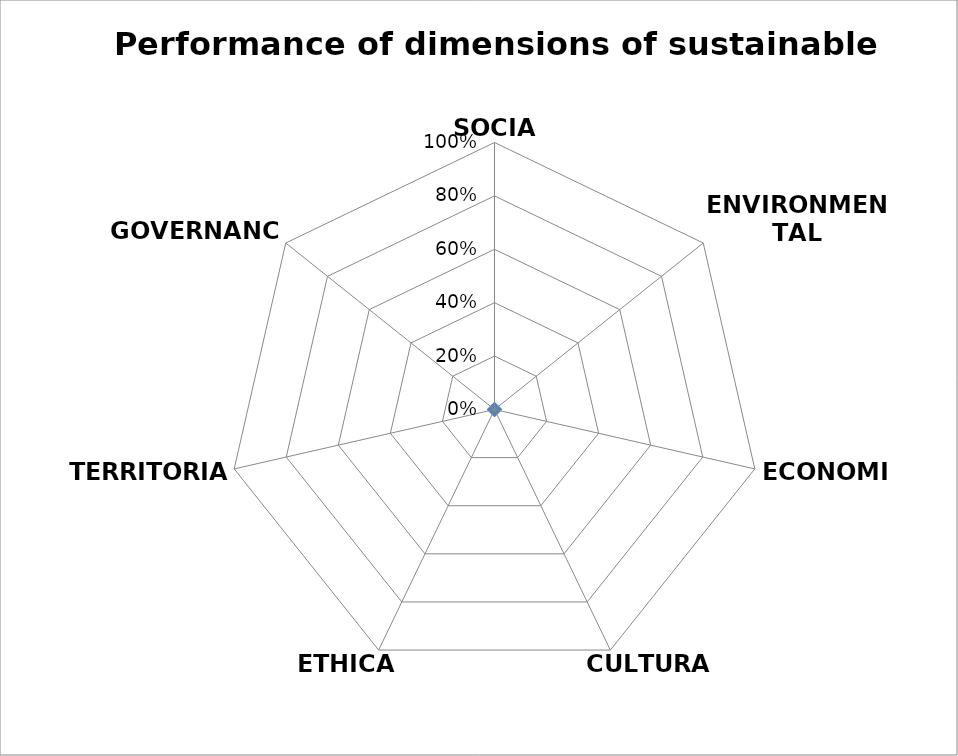
| Category | Series 0 |
|---|---|
| SOCIAL | 0 |
| ENVIRONMENTAL | 0 |
| ECONOMIC | 0 |
| CULTURAL | 0 |
| ETHICAL | 0 |
| TERRITORIAL | 0 |
| GOVERNANCE | 0 |